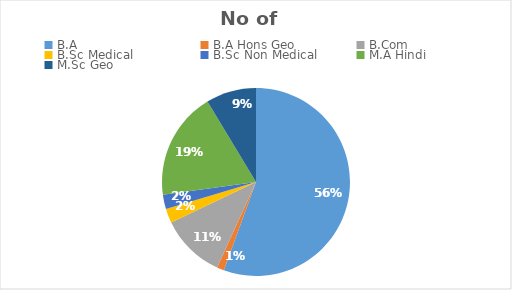
| Category | No of students |
|---|---|
| B.A | 45 |
| B.A Hons Geo | 1 |
| B.Com | 9 |
| B.Sc Medical | 2 |
| B.Sc Non Medical | 2 |
| M.A Hindi | 15 |
| M.Sc Geo | 7 |